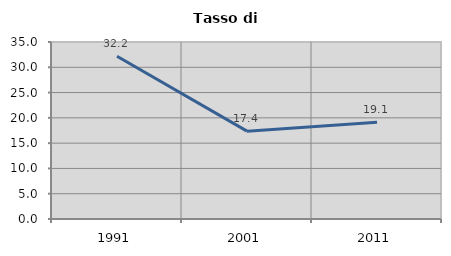
| Category | Tasso di disoccupazione   |
|---|---|
| 1991.0 | 32.177 |
| 2001.0 | 17.375 |
| 2011.0 | 19.113 |